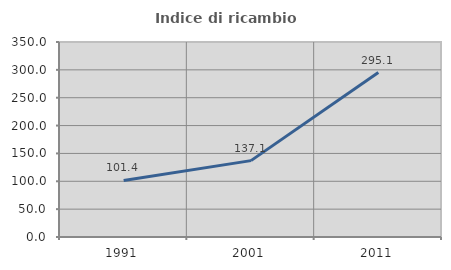
| Category | Indice di ricambio occupazionale  |
|---|---|
| 1991.0 | 101.446 |
| 2001.0 | 137.072 |
| 2011.0 | 295.146 |